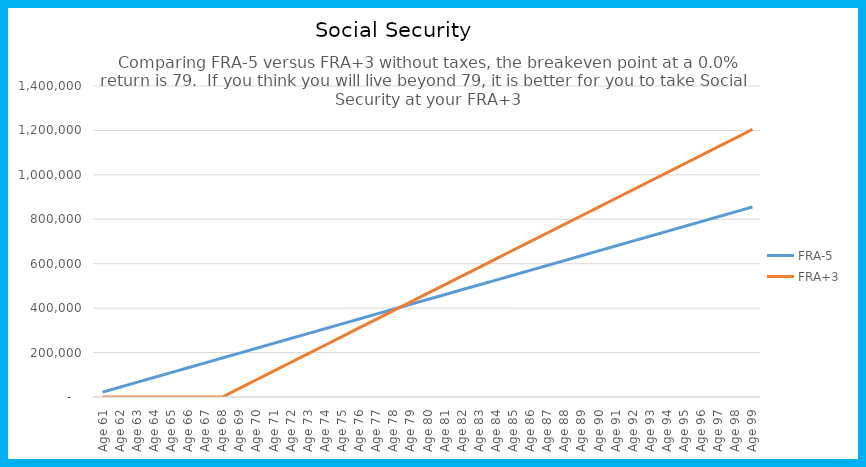
| Category | FRA-5 | FRA+3 |
|---|---|---|
| Age 61 | 21932.4 | 0 |
| Age 62 | 43864.8 | 0 |
| Age 63 | 65797.2 | 0 |
| Age 64 | 87729.6 | 0 |
| Age 65 | 109662 | 0 |
| Age 66 | 131594.4 | 0 |
| Age 67 | 153526.8 | 0 |
| Age 68 | 175459.2 | 0 |
| Age 69 | 197391.6 | 38851.68 |
| Age 70 | 219324 | 77703.36 |
| Age 71 | 241256.4 | 116555.04 |
| Age 72 | 263188.8 | 155406.72 |
| Age 73 | 285121.2 | 194258.4 |
| Age 74 | 307053.6 | 233110.08 |
| Age 75 | 328986 | 271961.76 |
| Age 76 | 350918.4 | 310813.44 |
| Age 77 | 372850.8 | 349665.12 |
| Age 78 | 394783.2 | 388516.8 |
| Age 79 | 416715.6 | 427368.48 |
| Age 80 | 438648 | 466220.16 |
| Age 81 | 460580.4 | 505071.84 |
| Age 82 | 482512.8 | 543923.52 |
| Age 83 | 504445.2 | 582775.2 |
| Age 84 | 526377.6 | 621626.88 |
| Age 85 | 548310 | 660478.56 |
| Age 86 | 570242.4 | 699330.24 |
| Age 87 | 592174.8 | 738181.92 |
| Age 88 | 614107.2 | 777033.6 |
| Age 89 | 636039.6 | 815885.28 |
| Age 90 | 657972 | 854736.96 |
| Age 91 | 679904.4 | 893588.64 |
| Age 92 | 701836.8 | 932440.32 |
| Age 93 | 723769.2 | 971292 |
| Age 94 | 745701.6 | 1010143.68 |
| Age 95 | 767634 | 1048995.36 |
| Age 96 | 789566.4 | 1087847.04 |
| Age 97 | 811498.8 | 1126698.72 |
| Age 98 | 833431.2 | 1165550.4 |
| Age 99 | 855363.6 | 1204402.08 |